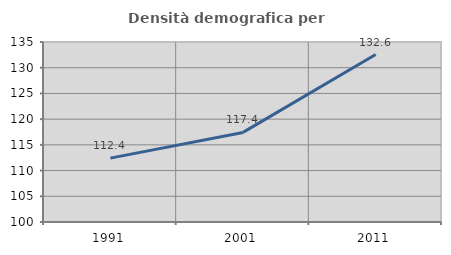
| Category | Densità demografica |
|---|---|
| 1991.0 | 112.422 |
| 2001.0 | 117.421 |
| 2011.0 | 132.564 |